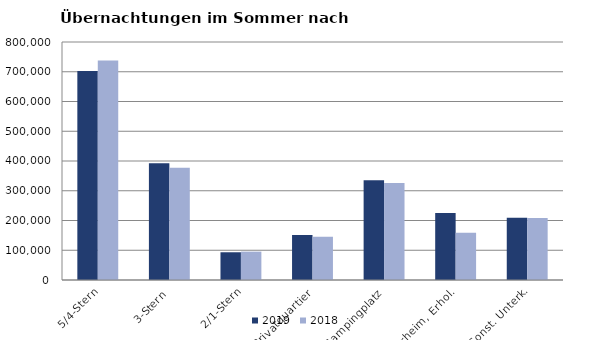
| Category | 2019 | 2018 |
|---|---|---|
| 5/4-Stern | 702275 | 737914 |
| 3-Stern | 392129 | 377484 |
| 2/1-Stern | 93237 | 95343 |
| Privatquartier | 151199 | 145268 |
| Campingplatz | 334948 | 325900 |
| Kurheim, Erhol. | 224917 | 158915 |
| Sonst. Unterk. | 209353 | 208070 |